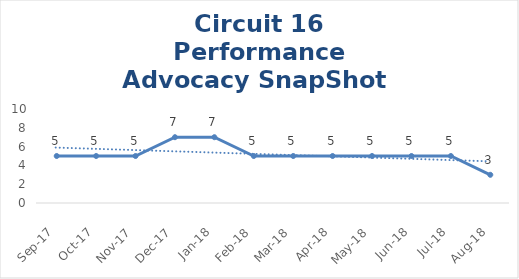
| Category | Circuit 16 |
|---|---|
| Sep-17 | 5 |
| Oct-17 | 5 |
| Nov-17 | 5 |
| Dec-17 | 7 |
| Jan-18 | 7 |
| Feb-18 | 5 |
| Mar-18 | 5 |
| Apr-18 | 5 |
| May-18 | 5 |
| Jun-18 | 5 |
| Jul-18 | 5 |
| Aug-18 | 3 |